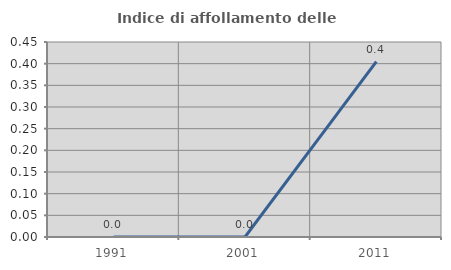
| Category | Indice di affollamento delle abitazioni  |
|---|---|
| 1991.0 | 0 |
| 2001.0 | 0 |
| 2011.0 | 0.405 |